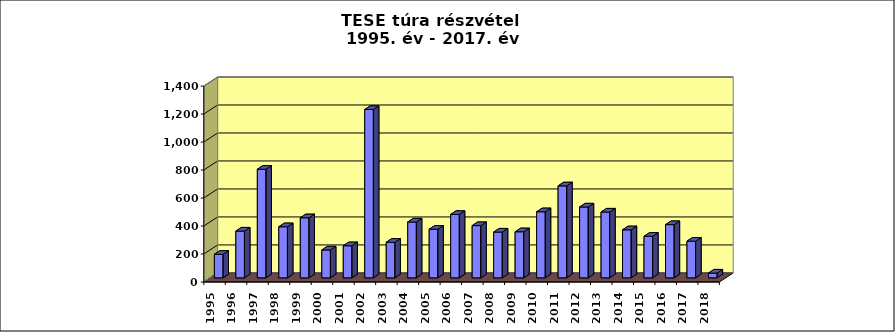
| Category | Részvétel |
|---|---|
| 1995. | 168 |
| 1996. | 334 |
| 1997. | 776 |
| 1998. | 365 |
| 1999. | 429 |
| 2000. | 199 |
| 2001. | 229 |
| 2002. | 1203 |
| 2003. | 254 |
| 2004. | 399 |
| 2005. | 347 |
| 2006. | 453 |
| 2007. | 373 |
| 2008. | 327 |
| 2009. | 329 |
| 2010. | 472 |
| 2011. | 657 |
| 2012. | 506 |
| 2013. | 470 |
| 2014. | 343 |
| 2015. | 297 |
| 2016. | 380 |
| 2017. | 262 |
| 2018. | 34 |